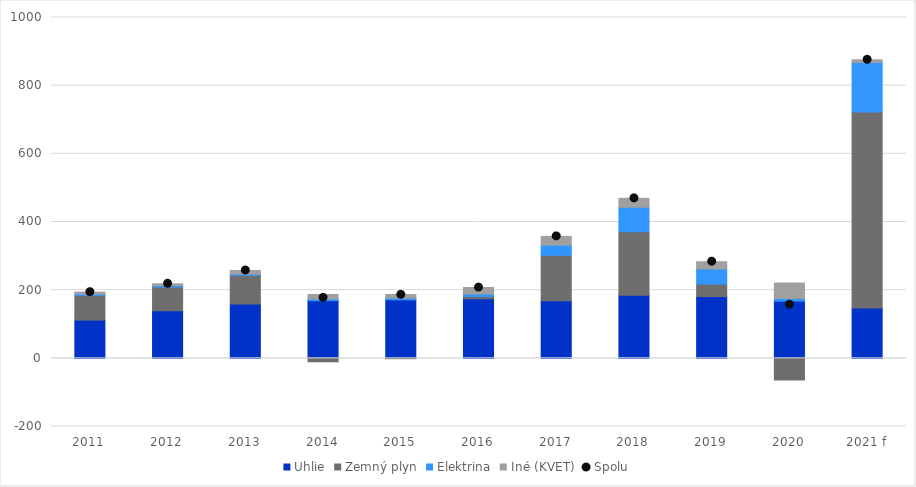
| Category | Uhlie | Zemný plyn | Elektrina | Iné (KVET) |
|---|---|---|---|---|
| 2011 | 112.115 | 72.229 | 3.691 | 6.101 |
| 2012 | 139.618 | 69.481 | 4.161 | 5.503 |
| 2013 | 159.377 | 84.084 | 3.714 | 10.527 |
| 2014 | 169.166 | -10.061 | 5.036 | 13.199 |
| 2015 | 171.65 | -1.034 | 5.213 | 10.461 |
| 2016 | 174.479 | 7.169 | 7.453 | 18.459 |
| 2017 | 168.815 | 133.452 | 29.899 | 25.671 |
| 2018 | 185.104 | 186.405 | 71.781 | 26.137 |
| 2019 | 181.297 | 36.791 | 44.113 | 21.387 |
| 2020 | 167.931 | -63.526 | 7.738 | 45.308 |
| 2021 f | 147.334 | 575.518 | 145.07 | 8.002 |